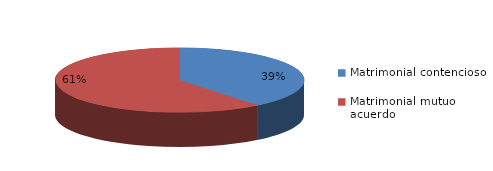
| Category | Series 0 |
|---|---|
| 0 | 661 |
| 1 | 1021 |